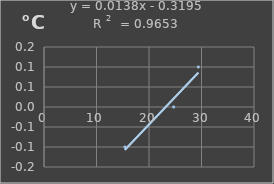
| Category | Temperatura |
|---|---|
| 15.4 | -0.1 |
| 24.7 | 0 |
| 29.4 | 0.1 |